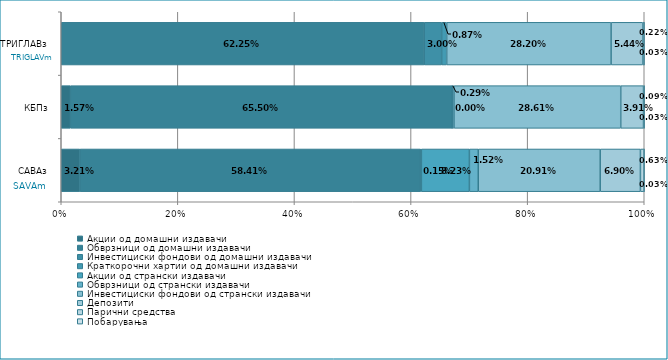
| Category | Акции од домашни издавачи  | Обврзници од домашни издавачи  | Инвестициски фондови од домашни издавачи  | Краткорочни хартии од домашни издавачи  | Акции од странски издавачи  | Обврзници од странски издавачи  | Инвестициски фондови од странски издавaчи | Депозити  | Парични средства  | Побарувања |
|---|---|---|---|---|---|---|---|---|---|---|
| САВАз | 0.032 | 0.584 | 0.002 | 0 | 0.082 | 0.015 | 0.209 | 0.069 | 0.006 | 0 |
| КБПз | 0.016 | 0.655 | 0 | 0 | 0 | 0.003 | 0.286 | 0.039 | 0.001 | 0 |
| ТРИГЛАВз | 0 | 0.623 | 0.03 | 0.009 | 0 | 0 | 0.282 | 0.054 | 0.002 | 0 |